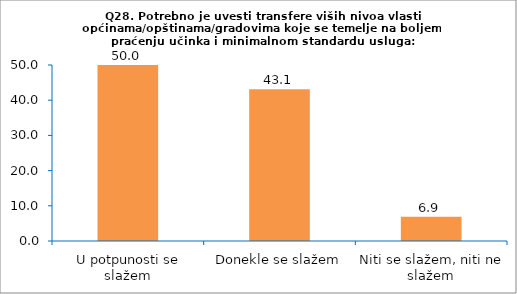
| Category | Series 0 |
|---|---|
| U potpunosti se slažem | 50 |
| Donekle se slažem | 43.103 |
| Niti se slažem, niti ne slažem | 6.897 |